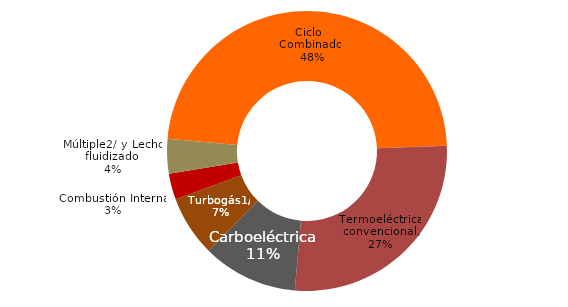
| Category | Series 0 |
|---|---|
| Ciclo Combinado | 0.48 |
| Termoeléctrica convencional | 0.27 |
| Carboeléctrica | 0.11 |
| Turbogás1/ | 0.07 |
| Combustión Interna | 0.03 |
| Múltiple2/ y Lecho fluidizado | 0.04 |